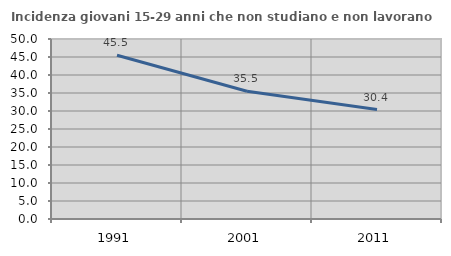
| Category | Incidenza giovani 15-29 anni che non studiano e non lavorano  |
|---|---|
| 1991.0 | 45.49 |
| 2001.0 | 35.489 |
| 2011.0 | 30.403 |